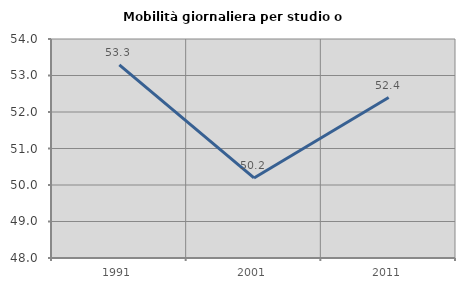
| Category | Mobilità giornaliera per studio o lavoro |
|---|---|
| 1991.0 | 53.289 |
| 2001.0 | 50.193 |
| 2011.0 | 52.396 |